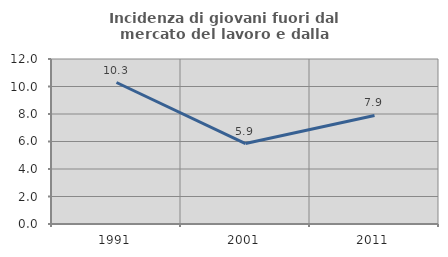
| Category | Incidenza di giovani fuori dal mercato del lavoro e dalla formazione  |
|---|---|
| 1991.0 | 10.291 |
| 2001.0 | 5.852 |
| 2011.0 | 7.892 |